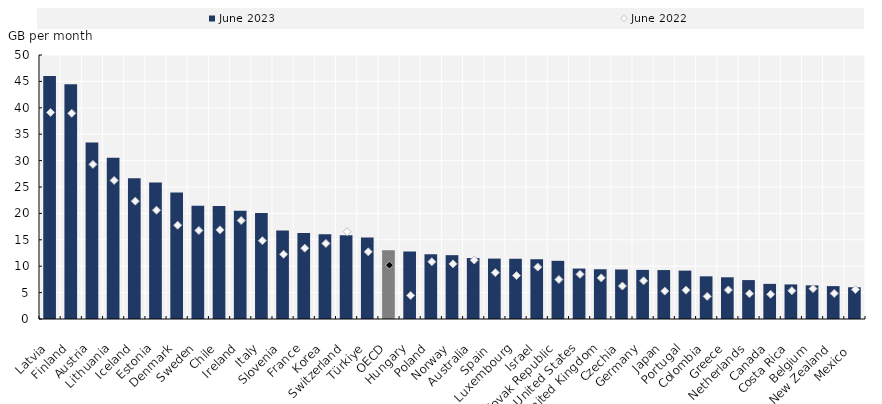
| Category | June 2023 |
|---|---|
| Latvia | 46.03 |
| Finland | 44.48 |
| Austria | 33.43 |
| Lithuania | 30.55 |
| Iceland | 26.68 |
| Estonia | 25.85 |
| Denmark | 23.96 |
| Sweden | 21.45 |
| Chile | 21.4 |
| Ireland | 20.5 |
| Italy | 20.08 |
| Slovenia | 16.74 |
| France | 16.3 |
| Korea | 16.04 |
| Switzerland | 15.87 |
| Türkiye | 15.42 |
| OECD | 13.02 |
| Hungary | 12.8 |
| Poland | 12.27 |
| Norway | 12.09 |
| Australia | 11.54 |
| Spain  | 11.44 |
| Luxembourg | 11.41 |
| Israel | 11.32 |
| Slovak Republic | 11.02 |
| United States | 9.55 |
| United Kingdom | 9.42 |
| Czechia | 9.38 |
| Germany | 9.3 |
| Japan | 9.27 |
| Portugal | 9.16 |
| Colombia | 8.08 |
| Greece | 7.9 |
| Netherlands | 7.37 |
| Canada | 6.65 |
| Costa Rica | 6.55 |
| Belgium | 6.37 |
| New Zealand | 6.23 |
| Mexico  | 6.01 |